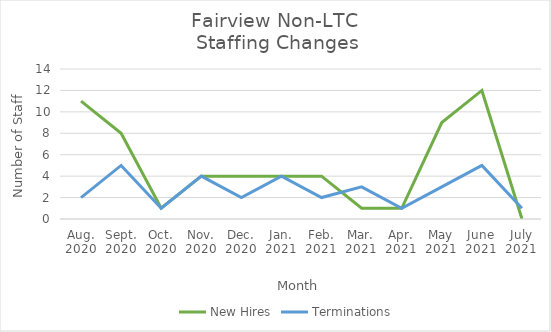
| Category | New Hires | Terminations |
|---|---|---|
| Aug.
2020 | 11 | 2 |
| Sept.
2020 | 8 | 5 |
| Oct.
2020 | 1 | 1 |
| Nov.
2020 | 4 | 4 |
| Dec.
2020 | 4 | 2 |
| Jan.
2021 | 4 | 4 |
| Feb.
2021 | 4 | 2 |
| Mar.
2021 | 1 | 3 |
| Apr.
2021 | 1 | 1 |
| May
2021 | 9 | 3 |
| June
2021 | 12 | 5 |
| July
2021 | 0 | 1 |